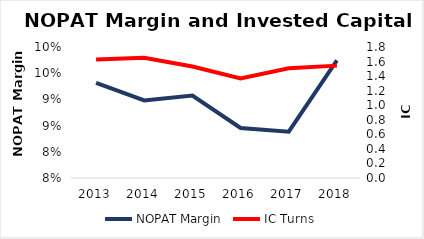
| Category | NOPAT Margin |
|---|---|
| 2013.0 | 0.093 |
| 2014.0 | 0.09 |
| 2015.0 | 0.091 |
| 2016.0 | 0.085 |
| 2017.0 | 0.084 |
| 2018.0 | 0.097 |